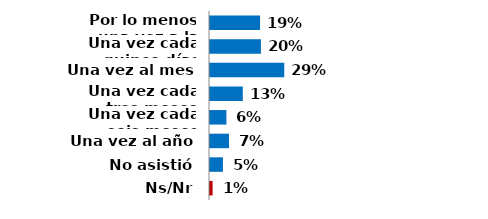
| Category | Series 0 |
|---|---|
| Por lo menos una vez a la semana | 0.193 |
| Una vez cada quince días | 0.197 |
| Una vez al mes | 0.287 |
| Una vez cada tres meses | 0.127 |
| Una vez cada seis meses | 0.063 |
| Una vez al año | 0.073 |
| No asistió | 0.05 |
| Ns/Nr | 0.01 |